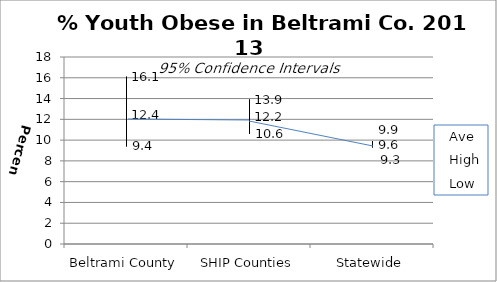
| Category | Ave | High | Low |
|---|---|---|---|
| Beltrami County | 12.4 | 16.1 | 9.4 |
| SHIP Counties | 12.2 | 13.9 | 10.6 |
| Statewide | 9.6 | 9.9 | 9.3 |